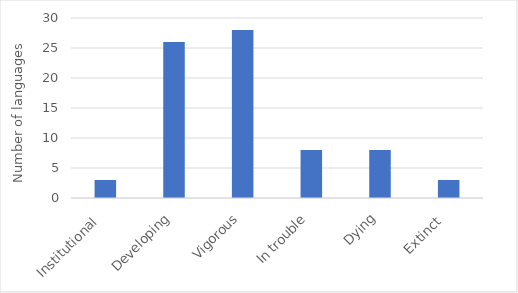
| Category | Number of languages  |
|---|---|
| Institutional  | 3 |
| Developing | 26 |
| Vigorous | 28 |
| In trouble | 8 |
| Dying | 8 |
| Extinct  | 3 |